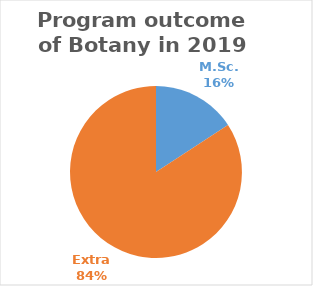
| Category | Series 0 |
|---|---|
| M.Sc. | 3 |
| Extra | 16 |